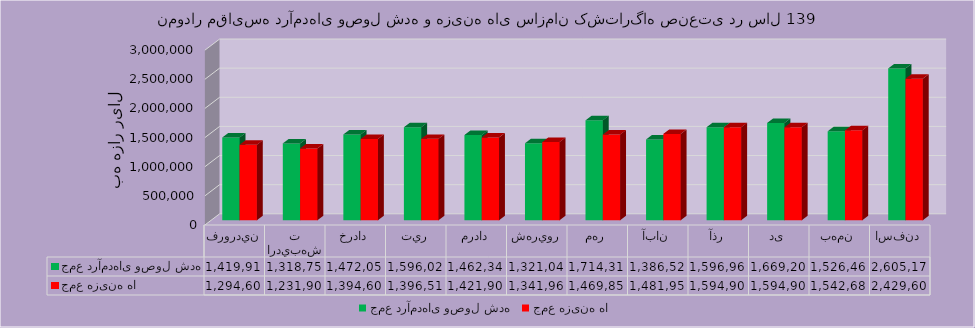
| Category | جمع درآمدهای وصول شده | جمع هزینه ها |
|---|---|---|
| فروردين | 1419910 | 1294600 |
| ارديبهشت | 1318754 | 1231901 |
| خرداد | 1472051 | 1394600 |
| تير | 1596020 | 1396510 |
| مرداد | 1462347 | 1421900 |
| شهريور | 1321042 | 1341965 |
| مهر | 1714312 | 1469850 |
| آبان | 1386526 | 1481950 |
| آذر | 1596965 | 1594900 |
| دی | 1669200 | 1594900 |
| بهمن | 1526465 | 1542686 |
| اسفند | 2605170 | 2429600 |